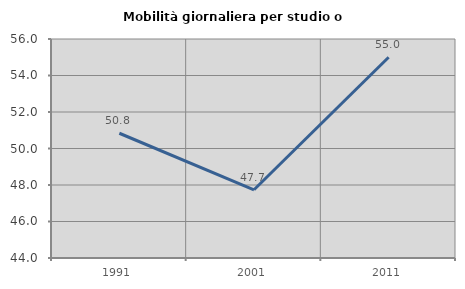
| Category | Mobilità giornaliera per studio o lavoro |
|---|---|
| 1991.0 | 50.835 |
| 2001.0 | 47.739 |
| 2011.0 | 54.998 |